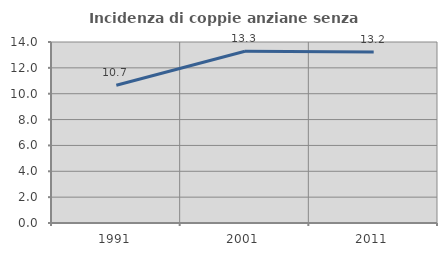
| Category | Incidenza di coppie anziane senza figli  |
|---|---|
| 1991.0 | 10.653 |
| 2001.0 | 13.283 |
| 2011.0 | 13.226 |